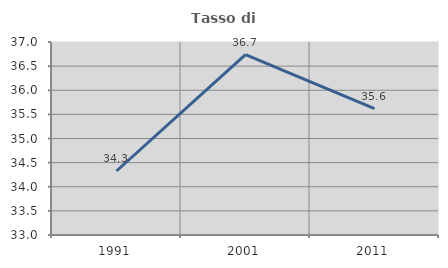
| Category | Tasso di occupazione   |
|---|---|
| 1991.0 | 34.327 |
| 2001.0 | 36.738 |
| 2011.0 | 35.619 |